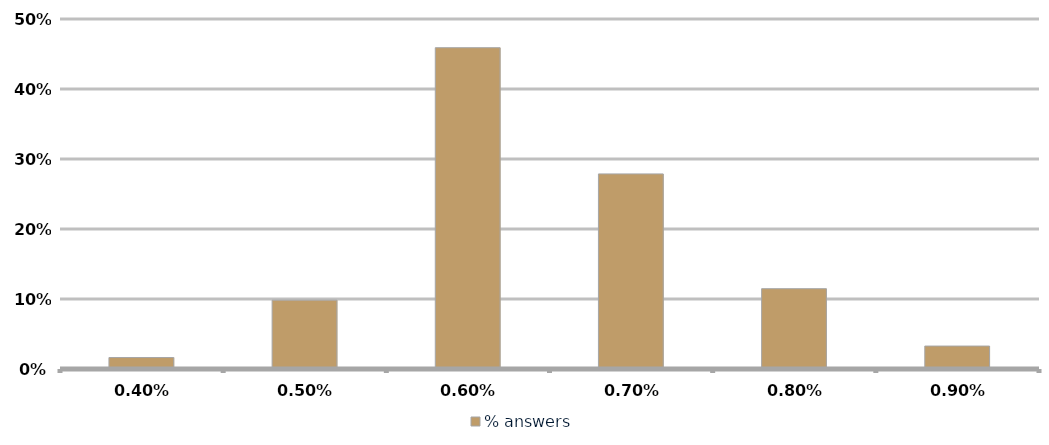
| Category | % answers |
|---|---|
| 0.004 | 0.016 |
| 0.005 | 0.098 |
| 0.006 | 0.459 |
| 0.007 | 0.279 |
| 0.008 | 0.115 |
| 0.009000000000000001 | 0.033 |